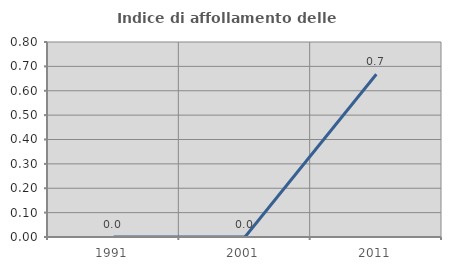
| Category | Indice di affollamento delle abitazioni  |
|---|---|
| 1991.0 | 0 |
| 2001.0 | 0 |
| 2011.0 | 0.668 |